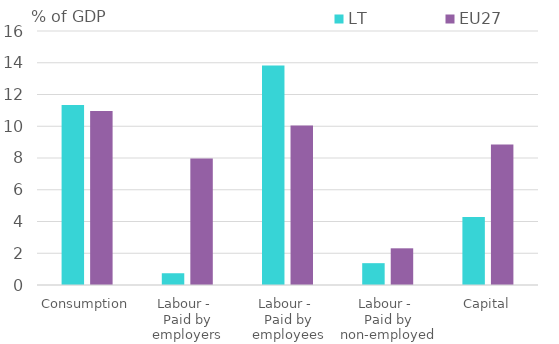
| Category | LT | EU27 |
|---|---|---|
| Consumption | 11.337 | 10.967 |
| Labour - 
Paid by employers | 0.741 | 7.966 |
| Labour - 
Paid by employees | 13.83 | 10.052 |
| Labour - 
Paid by non-employed | 1.375 | 2.311 |
| Capital | 4.289 | 8.858 |